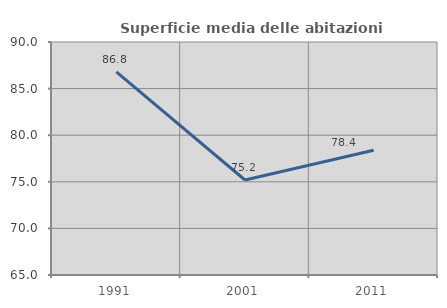
| Category | Superficie media delle abitazioni occupate |
|---|---|
| 1991.0 | 86.787 |
| 2001.0 | 75.191 |
| 2011.0 | 78.39 |